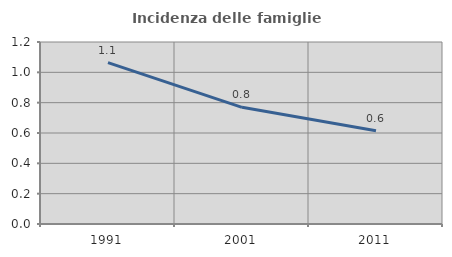
| Category | Incidenza delle famiglie numerose |
|---|---|
| 1991.0 | 1.064 |
| 2001.0 | 0.769 |
| 2011.0 | 0.614 |